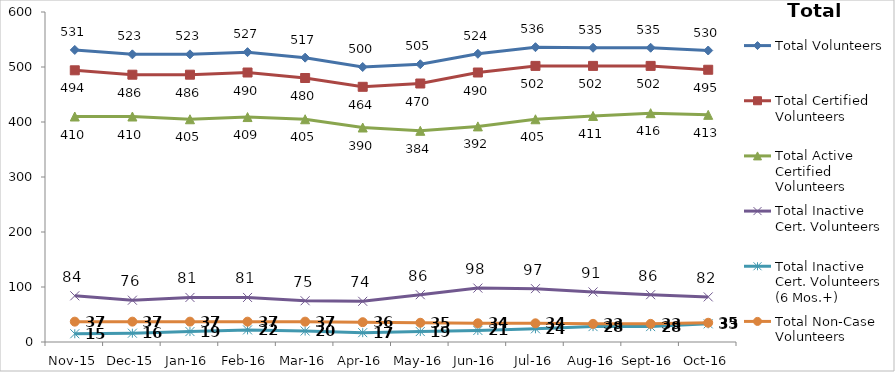
| Category | Total Volunteers | Total Certified Volunteers | Total Active Certified Volunteers | Total Inactive Cert. Volunteers | Total Inactive Cert. Volunteers (6 Mos.+) | Total Non-Case Volunteers |
|---|---|---|---|---|---|---|
| Nov-15 | 531 | 494 | 410 | 84 | 15 | 37 |
| Dec-15 | 523 | 486 | 410 | 76 | 16 | 37 |
| Jan-16 | 523 | 486 | 405 | 81 | 19 | 37 |
| Feb-16 | 527 | 490 | 409 | 81 | 22 | 37 |
| Mar-16 | 517 | 480 | 405 | 75 | 20 | 37 |
| Apr-16 | 500 | 464 | 390 | 74 | 17 | 36 |
| May-16 | 505 | 470 | 384 | 86 | 19 | 35 |
| Jun-16 | 524 | 490 | 392 | 98 | 21 | 34 |
| Jul-16 | 536 | 502 | 405 | 97 | 24 | 34 |
| Aug-16 | 535 | 502 | 411 | 91 | 28 | 33 |
| Sep-16 | 535 | 502 | 416 | 86 | 28 | 33 |
| Oct-16 | 530 | 495 | 413 | 82 | 33 | 35 |